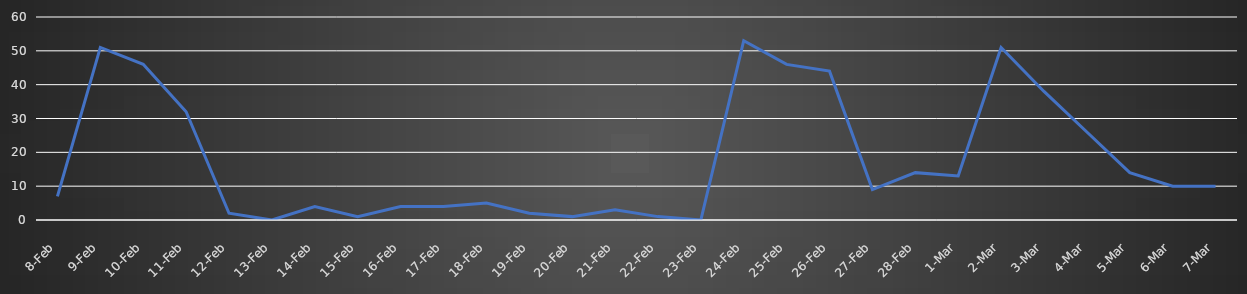
| Category | Users |
|---|---|
| 2021-02-08 | 7 |
| 2021-02-09 | 51 |
| 2021-02-10 | 46 |
| 2021-02-11 | 32 |
| 2021-02-12 | 2 |
| 2021-02-13 | 0 |
| 2021-02-14 | 4 |
| 2021-02-15 | 1 |
| 2021-02-16 | 4 |
| 2021-02-17 | 4 |
| 2021-02-18 | 5 |
| 2021-02-19 | 2 |
| 2021-02-20 | 1 |
| 2021-02-21 | 3 |
| 2021-02-22 | 1 |
| 2021-02-23 | 0 |
| 2021-02-24 | 53 |
| 2021-02-25 | 46 |
| 2021-02-26 | 44 |
| 2021-02-27 | 9 |
| 2021-02-28 | 14 |
| 2021-03-01 | 13 |
| 2021-03-02 | 51 |
| 2021-03-03 | 38 |
| 2021-03-04 | 26 |
| 2021-03-05 | 14 |
| 2021-03-06 | 10 |
| 2021-03-07 | 10 |